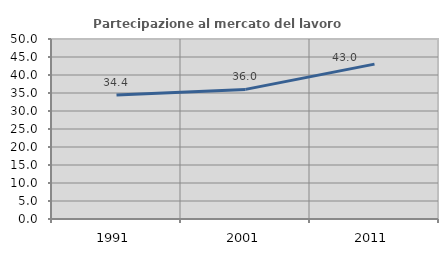
| Category | Partecipazione al mercato del lavoro  femminile |
|---|---|
| 1991.0 | 34.433 |
| 2001.0 | 36.006 |
| 2011.0 | 43.025 |